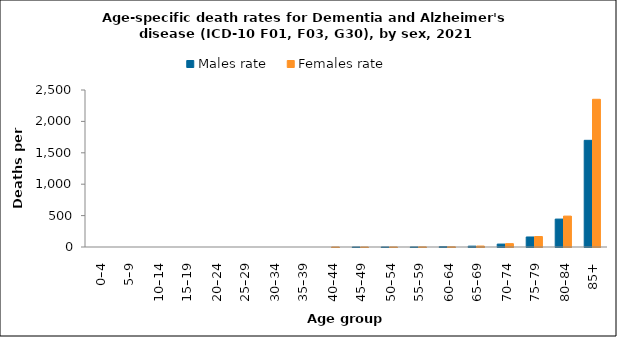
| Category | Males rate | Females rate |
|---|---|---|
| 0–4 | 0 | 0 |
| 5–9 | 0 | 0 |
| 10–14 | 0 | 0 |
| 15–19 | 0 | 0 |
| 20–24 | 0 | 0 |
| 25–29 | 0 | 0 |
| 30–34 | 0 | 0 |
| 35–39 | 0 | 0 |
| 40–44 | 0 | 0.119 |
| 45–49 | 0.122 | 0.12 |
| 50–54 | 0.252 | 0.734 |
| 55–59 | 0.656 | 2.031 |
| 60–64 | 5.203 | 3.582 |
| 65–69 | 13.602 | 15.092 |
| 70–74 | 46.512 | 53.371 |
| 75–79 | 159.601 | 166.924 |
| 80–84 | 444.468 | 492.137 |
| 85+ | 1698.616 | 2352.178 |